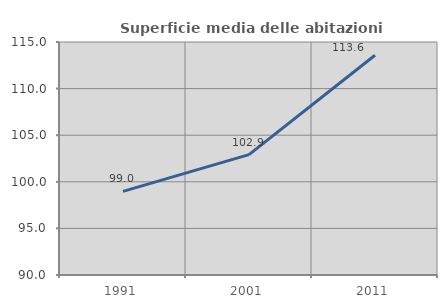
| Category | Superficie media delle abitazioni occupate |
|---|---|
| 1991.0 | 98.971 |
| 2001.0 | 102.918 |
| 2011.0 | 113.583 |